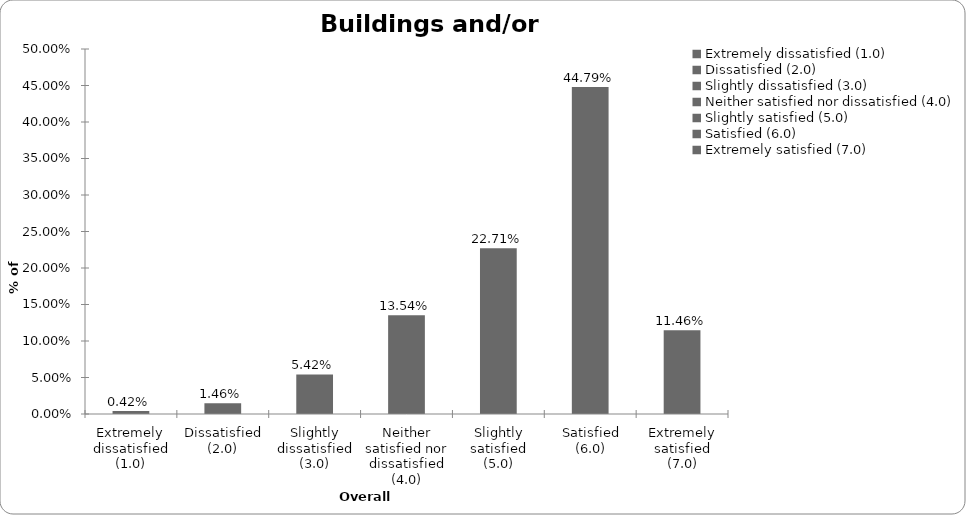
| Category | Series 0 |
|---|---|
| Extremely dissatisfied (1.0) | 0.004 |
| Dissatisfied (2.0) | 0.015 |
| Slightly dissatisfied (3.0) | 0.054 |
| Neither satisfied nor dissatisfied (4.0) | 0.135 |
| Slightly satisfied (5.0) | 0.227 |
| Satisfied (6.0) | 0.448 |
| Extremely satisfied (7.0) | 0.115 |